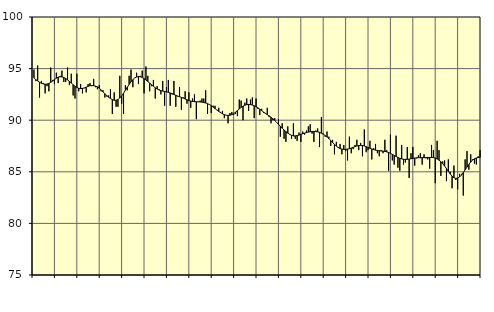
| Category | Piggar | Series 1 |
|---|---|---|
| nan | 94.9 | 94.1 |
| 1.0 | 93.8 | 93.92 |
| 1.0 | 95.3 | 93.81 |
| 1.0 | 92.2 | 93.68 |
| 1.0 | 93.8 | 93.58 |
| 1.0 | 93.6 | 93.51 |
| 1.0 | 92.6 | 93.48 |
| 1.0 | 93.3 | 93.5 |
| 1.0 | 92.8 | 93.56 |
| 1.0 | 95.1 | 93.66 |
| 1.0 | 93.9 | 93.79 |
| 1.0 | 93.5 | 93.94 |
| nan | 94.6 | 94.07 |
| 2.0 | 93.6 | 94.17 |
| 2.0 | 94.3 | 94.21 |
| 2.0 | 94.8 | 94.19 |
| 2.0 | 93.7 | 94.14 |
| 2.0 | 93.7 | 94.04 |
| 2.0 | 95.1 | 93.91 |
| 2.0 | 93.4 | 93.76 |
| 2.0 | 94.5 | 93.6 |
| 2.0 | 92.4 | 93.44 |
| 2.0 | 92.1 | 93.29 |
| 2.0 | 94.5 | 93.17 |
| nan | 92.8 | 93.09 |
| 3.0 | 93.5 | 93.06 |
| 3.0 | 92.6 | 93.08 |
| 3.0 | 93.1 | 93.13 |
| 3.0 | 92.7 | 93.2 |
| 3.0 | 93.5 | 93.28 |
| 3.0 | 93.6 | 93.34 |
| 3.0 | 93.3 | 93.36 |
| 3.0 | 94 | 93.35 |
| 3.0 | 93.2 | 93.3 |
| 3.0 | 93 | 93.23 |
| 3.0 | 93.4 | 93.1 |
| nan | 92.8 | 92.93 |
| 4.0 | 92.9 | 92.75 |
| 4.0 | 92.2 | 92.56 |
| 4.0 | 92.3 | 92.39 |
| 4.0 | 92.4 | 92.23 |
| 4.0 | 93 | 92.1 |
| 4.0 | 90.6 | 91.99 |
| 4.0 | 92.7 | 91.93 |
| 4.0 | 91.3 | 91.93 |
| 4.0 | 91.3 | 92 |
| 4.0 | 94.3 | 92.15 |
| 4.0 | 91.6 | 92.35 |
| nan | 90.6 | 92.61 |
| 5.0 | 93.4 | 92.9 |
| 5.0 | 92.9 | 93.19 |
| 5.0 | 94.3 | 93.47 |
| 5.0 | 94.9 | 93.72 |
| 5.0 | 93.2 | 93.93 |
| 5.0 | 94.1 | 94.09 |
| 5.0 | 94.6 | 94.19 |
| 5.0 | 93.5 | 94.23 |
| 5.0 | 94.3 | 94.21 |
| 5.0 | 94.8 | 94.14 |
| 5.0 | 92.6 | 94.03 |
| nan | 95.2 | 93.9 |
| 6.0 | 94.3 | 93.75 |
| 6.0 | 92.8 | 93.6 |
| 6.0 | 93.3 | 93.44 |
| 6.0 | 93.9 | 93.28 |
| 6.0 | 92.1 | 93.14 |
| 6.0 | 93.3 | 93.03 |
| 6.0 | 93 | 92.93 |
| 6.0 | 92.5 | 92.87 |
| 6.0 | 93.8 | 92.82 |
| 6.0 | 91.4 | 92.78 |
| 6.0 | 93.2 | 92.75 |
| nan | 93.9 | 92.7 |
| 7.0 | 91.4 | 92.64 |
| 7.0 | 92.5 | 92.57 |
| 7.0 | 93.8 | 92.49 |
| 7.0 | 91.3 | 92.41 |
| 7.0 | 92.3 | 92.34 |
| 7.0 | 93.2 | 92.28 |
| 7.0 | 91 | 92.21 |
| 7.0 | 92.2 | 92.14 |
| 7.0 | 92.8 | 92.05 |
| 7.0 | 91.6 | 91.97 |
| 7.0 | 92.7 | 91.9 |
| nan | 91.2 | 91.85 |
| 8.0 | 92.1 | 91.81 |
| 8.0 | 92.5 | 91.8 |
| 8.0 | 90.1 | 91.79 |
| 8.0 | 91.8 | 91.78 |
| 8.0 | 91.9 | 91.77 |
| 8.0 | 92.1 | 91.75 |
| 8.0 | 92.1 | 91.71 |
| 8.0 | 92.9 | 91.67 |
| 8.0 | 90.6 | 91.6 |
| 8.0 | 91.5 | 91.52 |
| 8.0 | 90.7 | 91.41 |
| nan | 91.4 | 91.27 |
| 9.0 | 91.4 | 91.13 |
| 9.0 | 91 | 90.99 |
| 9.0 | 91.2 | 90.86 |
| 9.0 | 90.8 | 90.73 |
| 9.0 | 90.9 | 90.62 |
| 9.0 | 90.2 | 90.54 |
| 9.0 | 90.5 | 90.48 |
| 9.0 | 89.7 | 90.46 |
| 9.0 | 90.7 | 90.48 |
| 9.0 | 90.8 | 90.54 |
| 9.0 | 90.5 | 90.64 |
| nan | 90.6 | 90.78 |
| 10.0 | 90.4 | 90.93 |
| 10.0 | 92 | 91.09 |
| 10.0 | 91.9 | 91.24 |
| 10.0 | 90 | 91.36 |
| 10.0 | 91.7 | 91.45 |
| 10.0 | 92.1 | 91.51 |
| 10.0 | 90.9 | 91.53 |
| 10.0 | 92 | 91.51 |
| 10.0 | 92.2 | 91.47 |
| 10.0 | 90.2 | 91.4 |
| 10.0 | 92.1 | 91.31 |
| nan | 91.1 | 91.2 |
| 11.0 | 90.5 | 91.07 |
| 11.0 | 91.1 | 90.93 |
| 11.0 | 90.7 | 90.79 |
| 11.0 | 90.7 | 90.66 |
| 11.0 | 91.2 | 90.54 |
| 11.0 | 90.3 | 90.42 |
| 11.0 | 89.7 | 90.29 |
| 11.0 | 90 | 90.14 |
| 11.0 | 90.2 | 89.97 |
| 11.0 | 89.8 | 89.79 |
| 11.0 | 90.1 | 89.6 |
| nan | 88.4 | 89.41 |
| 12.0 | 89.7 | 89.22 |
| 12.0 | 88.2 | 89.05 |
| 12.0 | 87.9 | 88.89 |
| 12.0 | 89.4 | 88.75 |
| 12.0 | 88.6 | 88.63 |
| 12.0 | 88.2 | 88.53 |
| 12.0 | 89.7 | 88.48 |
| 12.0 | 88.2 | 88.48 |
| 12.0 | 88 | 88.51 |
| 12.0 | 88.8 | 88.56 |
| 12.0 | 87.9 | 88.63 |
| nan | 88.9 | 88.69 |
| 13.0 | 88.6 | 88.75 |
| 13.0 | 89 | 88.8 |
| 13.0 | 89.4 | 88.85 |
| 13.0 | 89.6 | 88.88 |
| 13.0 | 88.7 | 88.9 |
| 13.0 | 87.9 | 88.91 |
| 13.0 | 89 | 88.9 |
| 13.0 | 89.2 | 88.87 |
| 13.0 | 87.4 | 88.82 |
| 13.0 | 90.3 | 88.74 |
| 13.0 | 88.7 | 88.65 |
| nan | 88.4 | 88.52 |
| 14.0 | 88.9 | 88.38 |
| 14.0 | 88.4 | 88.22 |
| 14.0 | 87.5 | 88.03 |
| 14.0 | 88.1 | 87.84 |
| 14.0 | 86.7 | 87.65 |
| 14.0 | 87.9 | 87.49 |
| 14.0 | 87.4 | 87.35 |
| 14.0 | 87.7 | 87.25 |
| 14.0 | 86.7 | 87.2 |
| 14.0 | 87.6 | 87.17 |
| 14.0 | 87 | 87.17 |
| nan | 86.1 | 87.2 |
| 15.0 | 88.4 | 87.24 |
| 15.0 | 86.8 | 87.3 |
| 15.0 | 87.2 | 87.37 |
| 15.0 | 87.6 | 87.44 |
| 15.0 | 88.1 | 87.5 |
| 15.0 | 87.1 | 87.54 |
| 15.0 | 87.8 | 87.56 |
| 15.0 | 86.5 | 87.55 |
| 15.0 | 89.1 | 87.5 |
| 15.0 | 86.9 | 87.43 |
| 15.0 | 87.1 | 87.36 |
| nan | 88 | 87.28 |
| 16.0 | 86.2 | 87.21 |
| 16.0 | 87.3 | 87.15 |
| 16.0 | 87.7 | 87.1 |
| 16.0 | 86.8 | 87.06 |
| 16.0 | 86.5 | 87.04 |
| 16.0 | 87.1 | 87.02 |
| 16.0 | 86.8 | 87 |
| 16.0 | 88.1 | 86.98 |
| 16.0 | 87.1 | 86.93 |
| 16.0 | 85.1 | 86.87 |
| 16.0 | 88.6 | 86.79 |
| nan | 86.1 | 86.69 |
| 17.0 | 85.7 | 86.59 |
| 17.0 | 88.5 | 86.49 |
| 17.0 | 85.4 | 86.39 |
| 17.0 | 85.1 | 86.31 |
| 17.0 | 87.6 | 86.25 |
| 17.0 | 85.7 | 86.21 |
| 17.0 | 85.9 | 86.2 |
| 17.0 | 87.4 | 86.21 |
| 17.0 | 84.4 | 86.23 |
| 17.0 | 86.8 | 86.27 |
| 17.0 | 87.4 | 86.3 |
| nan | 85.6 | 86.33 |
| 18.0 | 86.3 | 86.36 |
| 18.0 | 86.6 | 86.37 |
| 18.0 | 86.8 | 86.36 |
| 18.0 | 85.7 | 86.37 |
| 18.0 | 86.7 | 86.37 |
| 18.0 | 86.3 | 86.38 |
| 18.0 | 86.2 | 86.39 |
| 18.0 | 85.3 | 86.39 |
| 18.0 | 87.6 | 86.39 |
| 18.0 | 87.1 | 86.38 |
| 18.0 | 83.9 | 86.33 |
| nan | 88 | 86.25 |
| 19.0 | 87.1 | 86.13 |
| 19.0 | 84.6 | 85.98 |
| 19.0 | 86 | 85.79 |
| 19.0 | 86.1 | 85.56 |
| 19.0 | 84.1 | 85.31 |
| 19.0 | 86.2 | 85.05 |
| 19.0 | 85 | 84.8 |
| 19.0 | 83.4 | 84.58 |
| 19.0 | 85.6 | 84.43 |
| 19.0 | 84.2 | 84.36 |
| 19.0 | 83.3 | 84.39 |
| nan | 84.8 | 84.5 |
| 20.0 | 84.8 | 84.68 |
| 20.0 | 82.7 | 84.92 |
| 20.0 | 86.2 | 85.19 |
| 20.0 | 87 | 85.46 |
| 20.0 | 85.2 | 85.72 |
| 20.0 | 86.7 | 85.95 |
| 20.0 | 86.2 | 86.13 |
| 20.0 | 85.8 | 86.26 |
| 20.0 | 85.7 | 86.34 |
| 20.0 | 86.5 | 86.38 |
| 20.0 | 87.1 | 86.39 |